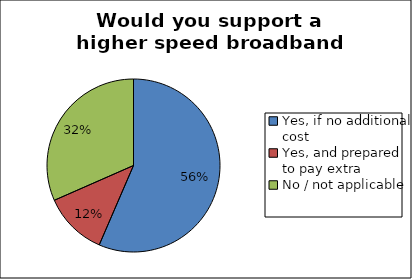
| Category | Series 0 |
|---|---|
| Yes, if no additional cost | 0.565 |
| Yes, and prepared to pay extra | 0.119 |
| No / not applicable | 0.316 |